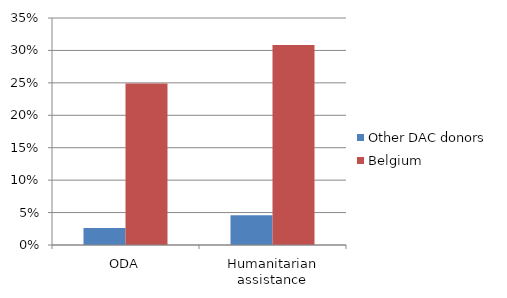
| Category | Other DAC donors | Belgium |
|---|---|---|
| ODA | 0.026 | 0.249 |
| Humanitarian assistance | 0.046 | 0.308 |